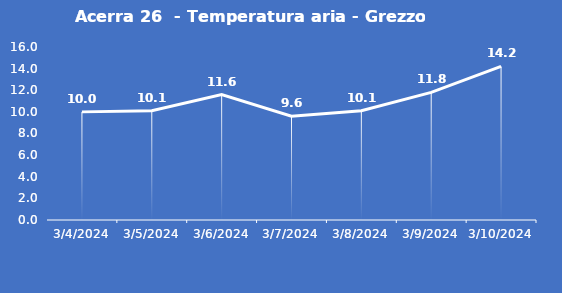
| Category | Acerra 26  - Temperatura aria - Grezzo (°C) |
|---|---|
| 3/4/24 | 10 |
| 3/5/24 | 10.1 |
| 3/6/24 | 11.6 |
| 3/7/24 | 9.6 |
| 3/8/24 | 10.1 |
| 3/9/24 | 11.8 |
| 3/10/24 | 14.2 |